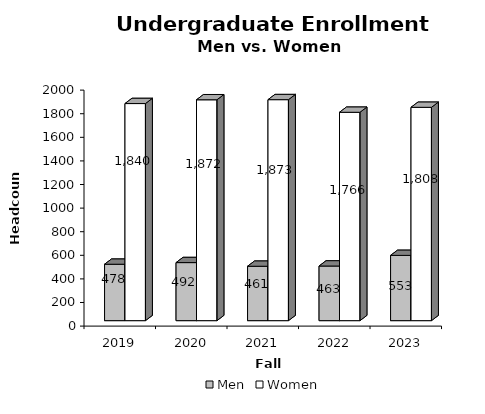
| Category | Men | Women |
|---|---|---|
| 2019.0 | 478 | 1840 |
| 2020.0 | 492 | 1872 |
| 2021.0 | 461 | 1873 |
| 2022.0 | 463 | 1766 |
| 2023.0 | 553 | 1808 |